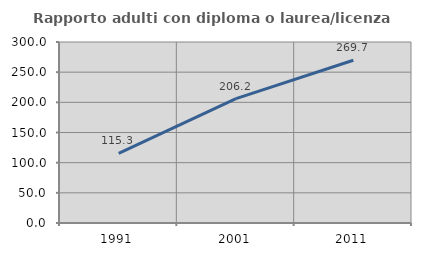
| Category | Rapporto adulti con diploma o laurea/licenza media  |
|---|---|
| 1991.0 | 115.341 |
| 2001.0 | 206.18 |
| 2011.0 | 269.714 |